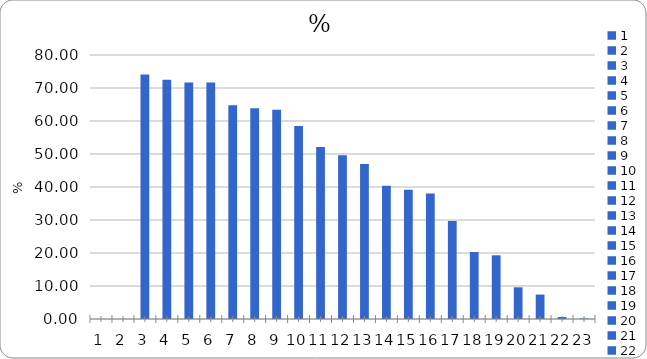
| Category | Women who did not have access to a medical provider during pregnancy |
|---|---|
| 0 | 0 |
| 1 | 0 |
| 2 | 74.1 |
| 3 | 72.5 |
| 4 | 71.7 |
| 5 | 71.7 |
| 6 | 64.8 |
| 7 | 63.9 |
| 8 | 63.4 |
| 9 | 58.5 |
| 10 | 52.1 |
| 11 | 49.6 |
| 12 | 47 |
| 13 | 40.4 |
| 14 | 39.2 |
| 15 | 38 |
| 16 | 29.7 |
| 17 | 20.3 |
| 18 | 19.3 |
| 19 | 9.6 |
| 20 | 7.4 |
| 21 | 0.6 |
| 22 | 0.2 |